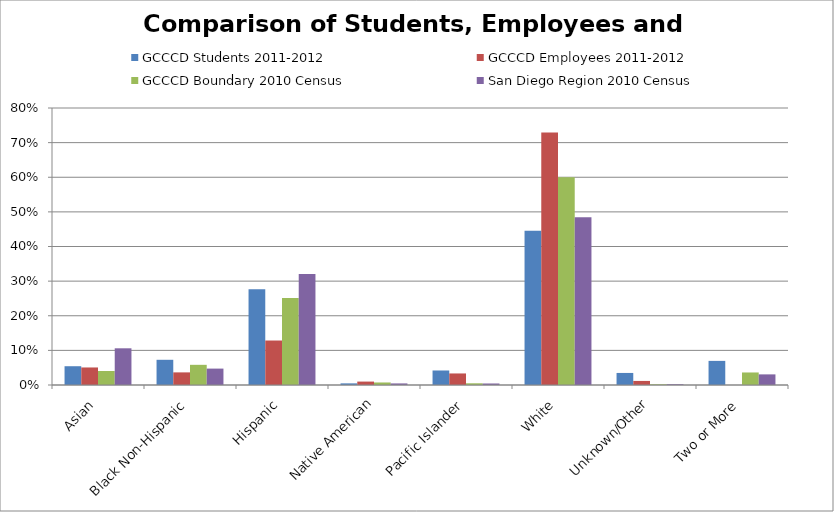
| Category | GCCCD Students 2011-2012 | GCCCD Employees 2011-2012 | GCCCD Boundary 2010 Census | San Diego Region 2010 Census |
|---|---|---|---|---|
| Asian | 0.054 | 0.051 | 0.04 | 0.106 |
| Black Non-Hispanic | 0.073 | 0.036 | 0.058 | 0.047 |
| Hispanic | 0.276 | 0.128 | 0.251 | 0.32 |
| Native American | 0.005 | 0.01 | 0.007 | 0.005 |
| Pacific Islander | 0.042 | 0.033 | 0.005 | 0.004 |
| White | 0.446 | 0.729 | 0.6 | 0.485 |
| Unknown/Other | 0.035 | 0.012 | 0.002 | 0.002 |
| Two or More | 0.07 | 0 | 0.036 | 0.031 |